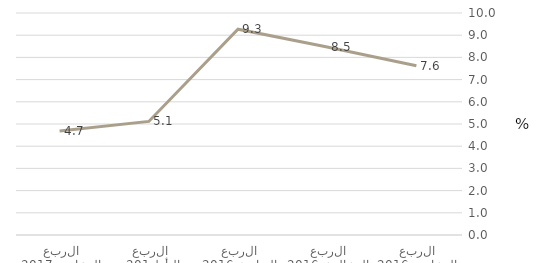
| Category | أنشطة الأسر المعيشية كصاحب عمل |
|---|---|
| الربع الثاني 2016 | 7.625 |
| الربع الثالث 2016 | 8.465 |
| الربع الرابع 2016 | 9.27 |
| الربع الأول 2017 | 5.116 |
| الربع الثاني 2017 | 4.687 |